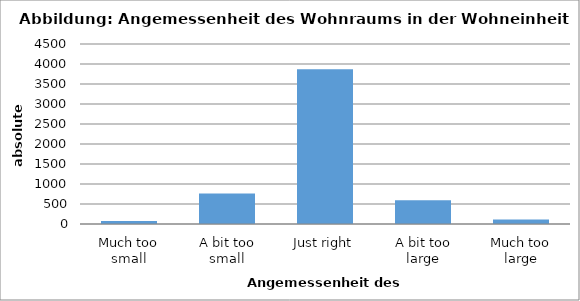
| Category | Series 0 |
|---|---|
| Much too small | 78 |
| A bit too small | 762 |
| Just right | 3868 |
| A bit too large | 593 |
| Much too large | 110 |